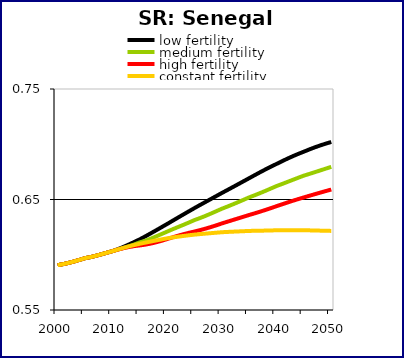
| Category | low fertility | medium fertility | high fertility | constant fertility |
|---|---|---|---|---|
| 2000.0 | 0.591 | 0.591 | 0.591 | 0.591 |
| 2001.0 | 0.592 | 0.592 | 0.592 | 0.592 |
| 2002.0 | 0.593 | 0.593 | 0.593 | 0.593 |
| 2003.0 | 0.594 | 0.594 | 0.594 | 0.594 |
| 2004.0 | 0.595 | 0.595 | 0.595 | 0.595 |
| 2005.0 | 0.597 | 0.597 | 0.597 | 0.597 |
| 2006.0 | 0.598 | 0.598 | 0.598 | 0.598 |
| 2007.0 | 0.599 | 0.599 | 0.599 | 0.599 |
| 2008.0 | 0.6 | 0.6 | 0.6 | 0.6 |
| 2009.0 | 0.602 | 0.602 | 0.602 | 0.602 |
| 2010.0 | 0.603 | 0.603 | 0.603 | 0.603 |
| 2011.0 | 0.605 | 0.605 | 0.605 | 0.605 |
| 2012.0 | 0.607 | 0.606 | 0.606 | 0.606 |
| 2013.0 | 0.609 | 0.608 | 0.607 | 0.608 |
| 2014.0 | 0.612 | 0.609 | 0.608 | 0.609 |
| 2015.0 | 0.614 | 0.611 | 0.608 | 0.61 |
| 2016.0 | 0.617 | 0.613 | 0.609 | 0.611 |
| 2017.0 | 0.619 | 0.615 | 0.61 | 0.612 |
| 2018.0 | 0.622 | 0.617 | 0.611 | 0.613 |
| 2019.0 | 0.625 | 0.619 | 0.613 | 0.614 |
| 2020.0 | 0.628 | 0.621 | 0.614 | 0.615 |
| 2021.0 | 0.631 | 0.623 | 0.616 | 0.616 |
| 2022.0 | 0.634 | 0.625 | 0.617 | 0.616 |
| 2023.0 | 0.637 | 0.627 | 0.619 | 0.617 |
| 2024.0 | 0.639 | 0.629 | 0.62 | 0.618 |
| 2025.0 | 0.642 | 0.631 | 0.621 | 0.618 |
| 2026.0 | 0.645 | 0.633 | 0.622 | 0.619 |
| 2027.0 | 0.648 | 0.635 | 0.624 | 0.619 |
| 2028.0 | 0.65 | 0.637 | 0.625 | 0.62 |
| 2029.0 | 0.653 | 0.639 | 0.627 | 0.62 |
| 2030.0 | 0.656 | 0.642 | 0.628 | 0.62 |
| 2031.0 | 0.659 | 0.644 | 0.63 | 0.621 |
| 2032.0 | 0.661 | 0.646 | 0.631 | 0.621 |
| 2033.0 | 0.664 | 0.648 | 0.633 | 0.621 |
| 2034.0 | 0.667 | 0.65 | 0.634 | 0.621 |
| 2035.0 | 0.669 | 0.652 | 0.636 | 0.622 |
| 2036.0 | 0.672 | 0.654 | 0.637 | 0.622 |
| 2037.0 | 0.675 | 0.656 | 0.639 | 0.622 |
| 2038.0 | 0.677 | 0.658 | 0.641 | 0.622 |
| 2039.0 | 0.68 | 0.66 | 0.642 | 0.622 |
| 2040.0 | 0.682 | 0.662 | 0.644 | 0.622 |
| 2041.0 | 0.685 | 0.664 | 0.646 | 0.622 |
| 2042.0 | 0.687 | 0.666 | 0.647 | 0.622 |
| 2043.0 | 0.689 | 0.668 | 0.649 | 0.622 |
| 2044.0 | 0.691 | 0.67 | 0.65 | 0.622 |
| 2045.0 | 0.693 | 0.672 | 0.652 | 0.622 |
| 2046.0 | 0.695 | 0.673 | 0.653 | 0.622 |
| 2047.0 | 0.697 | 0.675 | 0.655 | 0.622 |
| 2048.0 | 0.699 | 0.676 | 0.656 | 0.622 |
| 2049.0 | 0.701 | 0.678 | 0.658 | 0.622 |
| 2050.0 | 0.702 | 0.68 | 0.659 | 0.622 |